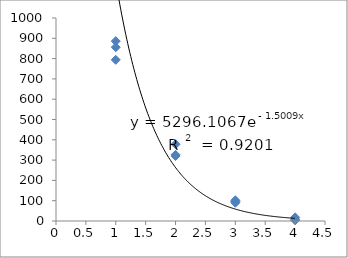
| Category | Series 0 |
|---|---|
| 1.0 | 794 |
| 1.0 | 856 |
| 1.0 | 886 |
| 2.0 | 320 |
| 2.0 | 378 |
| 2.0 | 326 |
| 3.0 | 96 |
| 3.0 | 102 |
| 3.0 | 90 |
| 4.0 | 18 |
| 4.0 | 9 |
| 4.0 | 4 |